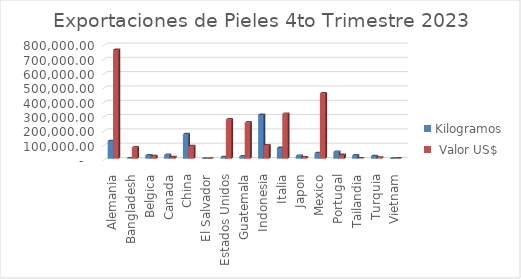
| Category | Kilogramos |  Valor US$ |
|---|---|---|
| Alemania | 123498.06 | 759846.46 |
| Bangladesh | 2400 | 78212.24 |
| Belgica | 23000 | 17250 |
| Canada | 26750 | 11676.98 |
| China | 170953 | 88396.84 |
| El Salvador | 5 | 77.86 |
| Estados Unidos | 11161 | 274300.43 |
| Guatemala | 15883 | 252947.43 |
| Indonesia | 305981.81 | 93030.31 |
| Italia | 74877.92 | 313282.07 |
| Japon | 20300 | 9670.92 |
| Mexico | 39281 | 456133.11 |
| Portugal | 48000 | 26400 |
| Tailandia | 22970 | 2526.7 |
| Turquia | 18500 | 7770 |
| Vietnam | 214.29 | 2223.01 |